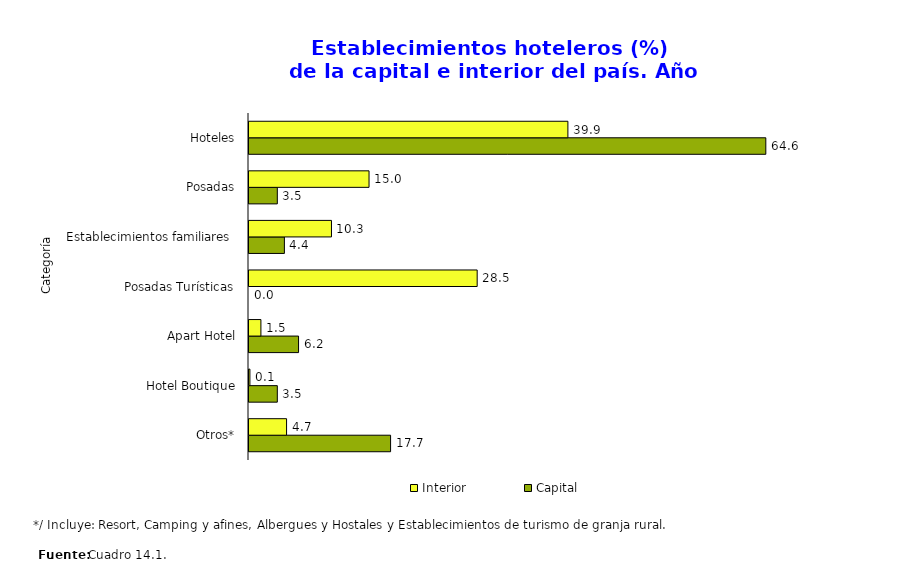
| Category | Capital | Interior |
|---|---|---|
| Otros* | 17.699 | 4.696 |
| Hotel Boutique | 3.54 | 0.115 |
| Apart Hotel | 6.195 | 1.489 |
| Posadas Turísticas | 0 | 28.522 |
| Establecimientos familiares  | 4.425 | 10.309 |
| Posadas | 3.54 | 15.006 |
| Hoteles | 64.602 | 39.863 |